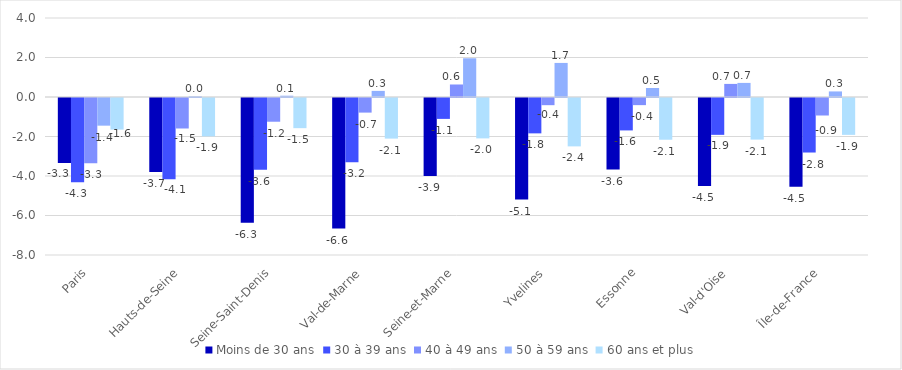
| Category | Moins de 30 ans | 30 à 39 ans | 40 à 49 ans | 50 à 59 ans | 60 ans et plus |
|---|---|---|---|---|---|
| Paris | -3.293 | -4.269 | -3.309 | -1.401 | -1.599 |
| Hauts-de-Seine | -3.745 | -4.12 | -1.544 | 0.034 | -1.942 |
| Seine-Saint-Denis | -6.314 | -3.638 | -1.201 | 0.065 | -1.527 |
| Val-de-Marne | -6.612 | -3.249 | -0.74 | 0.309 | -2.056 |
| Seine-et-Marne | -3.948 | -1.058 | 0.633 | 1.961 | -2.045 |
| Yvelines | -5.145 | -1.791 | -0.364 | 1.725 | -2.449 |
| Essonne | -3.625 | -1.642 | -0.361 | 0.456 | -2.113 |
| Val-d'Oise | -4.454 | -1.866 | 0.663 | 0.714 | -2.106 |
| Île-de-France | -4.498 | -2.761 | -0.886 | 0.282 | -1.867 |